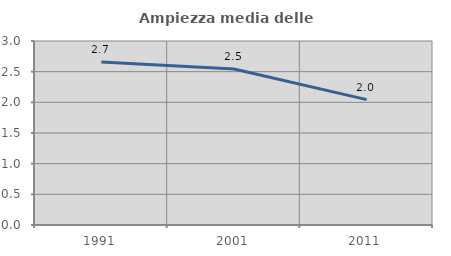
| Category | Ampiezza media delle famiglie |
|---|---|
| 1991.0 | 2.659 |
| 2001.0 | 2.545 |
| 2011.0 | 2.045 |